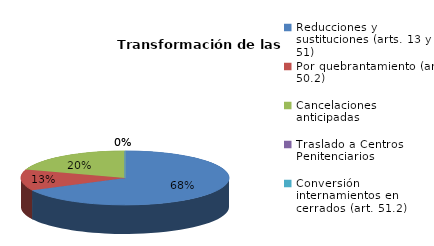
| Category | Series 0 |
|---|---|
| Reducciones y sustituciones (arts. 13 y 51) | 27 |
| Por quebrantamiento (art. 50.2) | 5 |
| Cancelaciones anticipadas | 8 |
| Traslado a Centros Penitenciarios | 0 |
| Conversión internamientos en cerrados (art. 51.2) | 0 |